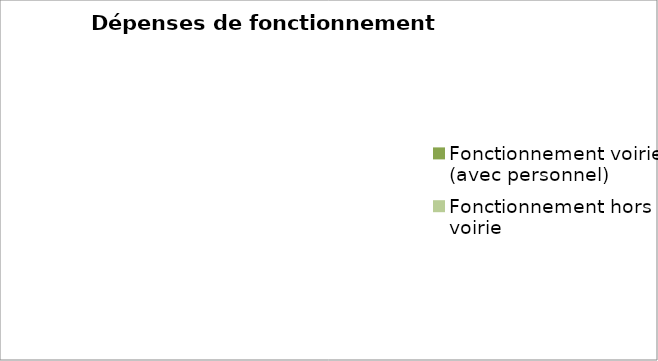
| Category | Series 0 |
|---|---|
| Fonctionnement voirie (avec personnel) | 0 |
| Fonctionnement hors voirie | 0 |